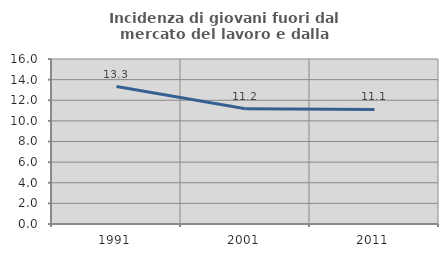
| Category | Incidenza di giovani fuori dal mercato del lavoro e dalla formazione  |
|---|---|
| 1991.0 | 13.333 |
| 2001.0 | 11.184 |
| 2011.0 | 11.111 |